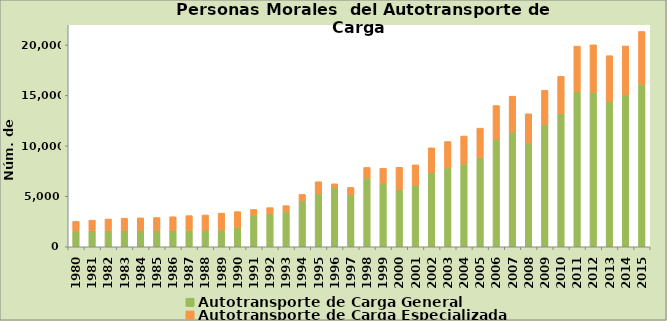
| Category | Autotransporte de Carga General | Autotransporte de Carga Especializada |
|---|---|---|
| 1980.0 | 1569 | 949 |
| 1981.0 | 1596 | 1046 |
| 1982.0 | 1602 | 1150 |
| 1983.0 | 1627 | 1200 |
| 1984.0 | 1626 | 1239 |
| 1985.0 | 1606 | 1289 |
| 1986.0 | 1609 | 1366 |
| 1987.0 | 1631 | 1456 |
| 1988.0 | 1633 | 1516 |
| 1989.0 | 1662 | 1675 |
| 1990.0 | 1892 | 1590 |
| 1991.0 | 3137 | 563 |
| 1992.0 | 3290 | 590 |
| 1993.0 | 3459 | 617 |
| 1994.0 | 4545 | 642 |
| 1995.0 | 5278 | 1171 |
| 1996.0 | 5841 | 398 |
| 1997.0 | 5107 | 776 |
| 1998.0 | 6812 | 1052 |
| 1999.0 | 6297 | 1486 |
| 2000.0 | 5669 | 2211 |
| 2001.0 | 6101 | 2017 |
| 2002.0 | 7351 | 2459 |
| 2003.0 | 7805 | 2627 |
| 2004.0 | 8202 | 2776 |
| 2005.0 | 8815 | 2943 |
| 2006.0 | 10632 | 3366 |
| 2007.0 | 11373 | 3550 |
| 2008.0 | 10287 | 2894 |
| 2009.0 | 12098 | 3412 |
| 2010.0 | 13210 | 3682 |
| 2011.0 | 15370 | 4517 |
| 2012.0 | 15298 | 4716 |
| 2013.0 | 14416 | 4521 |
| 2014.0 | 15084 | 4819 |
| 2015.0 | 16109 | 5228 |